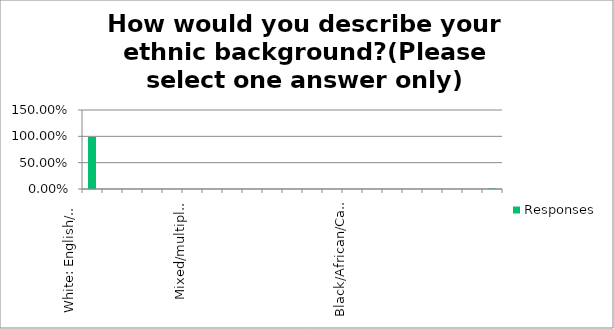
| Category | Responses |
|---|---|
| White: English/Welsh/Scottish/Northern Irish/British | 0.989 |
| White: Irish | 0 |
| White: Gypsy or Irish Traveller | 0 |
| White: Polish | 0 |
| White: Any other white background (write in box below if you wish) | 0 |
| Mixed/multiple ethnic groups: White and Black Caribbean | 0 |
| Mixed/multiple ethnic groups: White and Black African | 0 |
| Mixed/multiple ethnic groups: White and Asian | 0 |
| Mixed/multiple ethnic groups: Any other Mixed/multiple ethnic background (write in box below if you wish) | 0 |
| Asian/Asian British: Bangladeshi | 0 |
| Asian/Asian British: Indian | 0 |
| Asian/Asian British: Pakistani | 0 |
| Asian/Asian British: Chinese | 0 |
| Asian/Asian British: Any other Asian background (write in box below if you wish) | 0 |
| Black/African/Caribbean/Black British: African | 0 |
| Black/African/Caribbean/Black British: Caribbean | 0 |
| Black/African/Caribbean/Black British: Any other Black/African/Caribbean background  (write in box below if you wish) | 0 |
| Other: Arab | 0 |
| Other: Any other ethnic background  (write in box below if you wish) | 0 |
| Prefer not to say | 0 |
| Please specify in this box if you wish: | 0.011 |